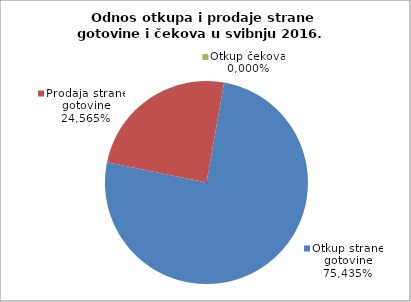
| Category | Otkup strane gotovine |
|---|---|
| 0 | 0.754 |
| 1 | 0.246 |
| 2 | 0 |